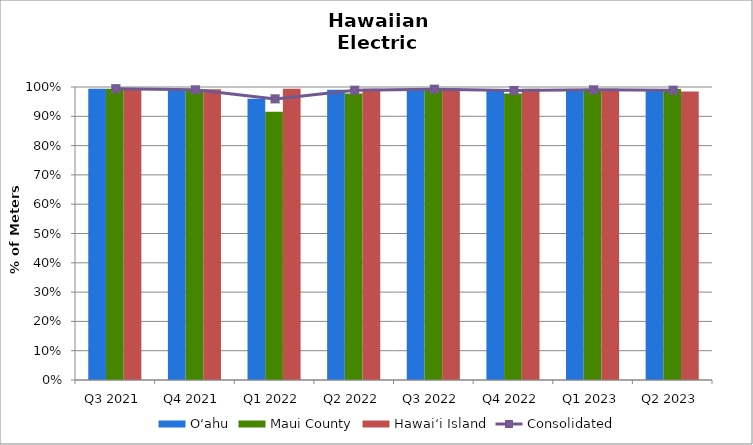
| Category | O‘ahu | Maui County | Hawai‘i Island |
|---|---|---|---|
| Q3 2021 | 0.994 | 0.994 | 0.996 |
| Q4 2021 | 0.99 | 0.99 | 0.992 |
| Q1 2022 | 0.96 | 0.916 | 0.994 |
| Q2 2022 | 0.99 | 0.978 | 0.994 |
| Q3 2022 | 0.991 | 0.996 | 0.995 |
| Q4 2022 | 0.989 | 0.978 | 0.994 |
| Q1 2023 | 0.989 | 0.991 | 0.994 |
| Q2 2023 | 0.989 | 0.993 | 0.985 |